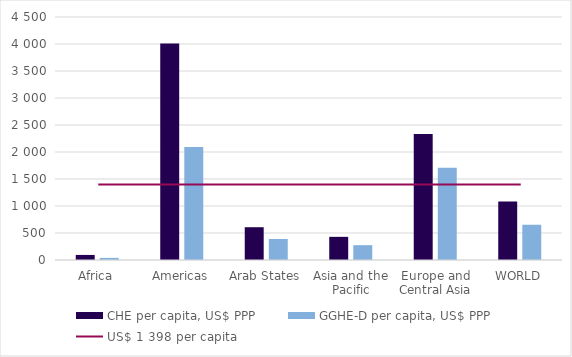
| Category | CHE per capita, US$ PPP | GGHE-D per capita, US$ PPP |
|---|---|---|
| Africa | 93.795 | 39.106 |
| Americas | 4010.071 | 2094.553 |
| Arab States | 606.996 | 388.694 |
| Asia and the Pacific | 428.728 | 274.581 |
| Europe and Central Asia | 2334.578 | 1706.435 |
| WORLD | 1082.326 | 652.672 |